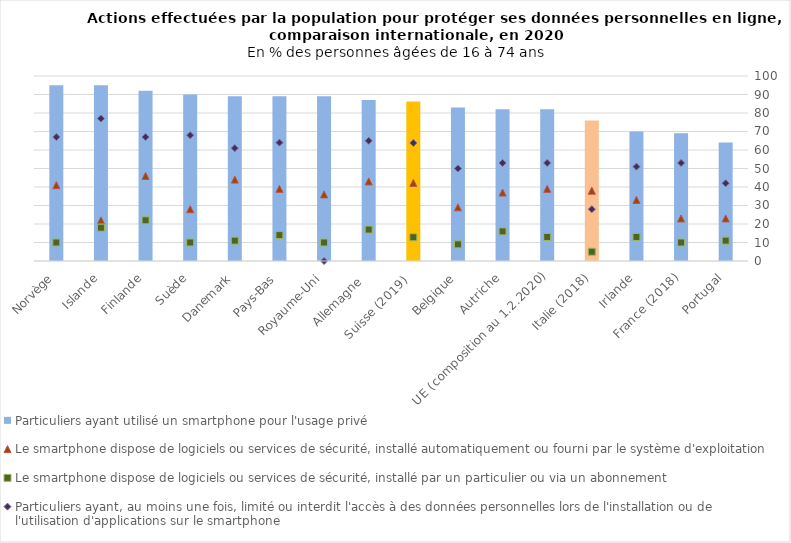
| Category | Particuliers ayant utilisé un smartphone pour l'usage privé |
|---|---|
| Portugal | 64 |
| France (2018) | 69 |
| Irlande | 70 |
| Italie (2018) | 76 |
| UE (composition au 1.2.2020) | 82 |
| Autriche | 82 |
| Belgique | 83 |
| Suisse (2019)  | 86.181 |
| Allemagne  | 87 |
| Royaume-Uni | 89 |
| Pays-Bas | 89 |
| Danemark | 89 |
| Suède | 90 |
| Finlande | 92 |
| Islande | 95 |
| Norvège | 95 |